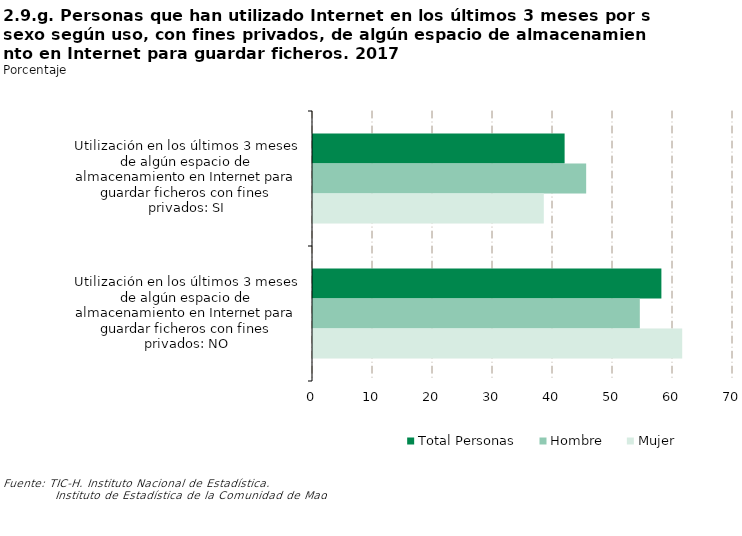
| Category | Total Personas | Hombre | Mujer |
|---|---|---|---|
| Utilización en los últimos 3 meses de algún espacio de almacenamiento en Internet para guardar ficheros con fines privados: SI | 41.935 | 45.529 | 38.465 |
| Utilización en los últimos 3 meses de algún espacio de almacenamiento en Internet para guardar ficheros con fines privados: NO | 58.065 | 54.471 | 61.535 |